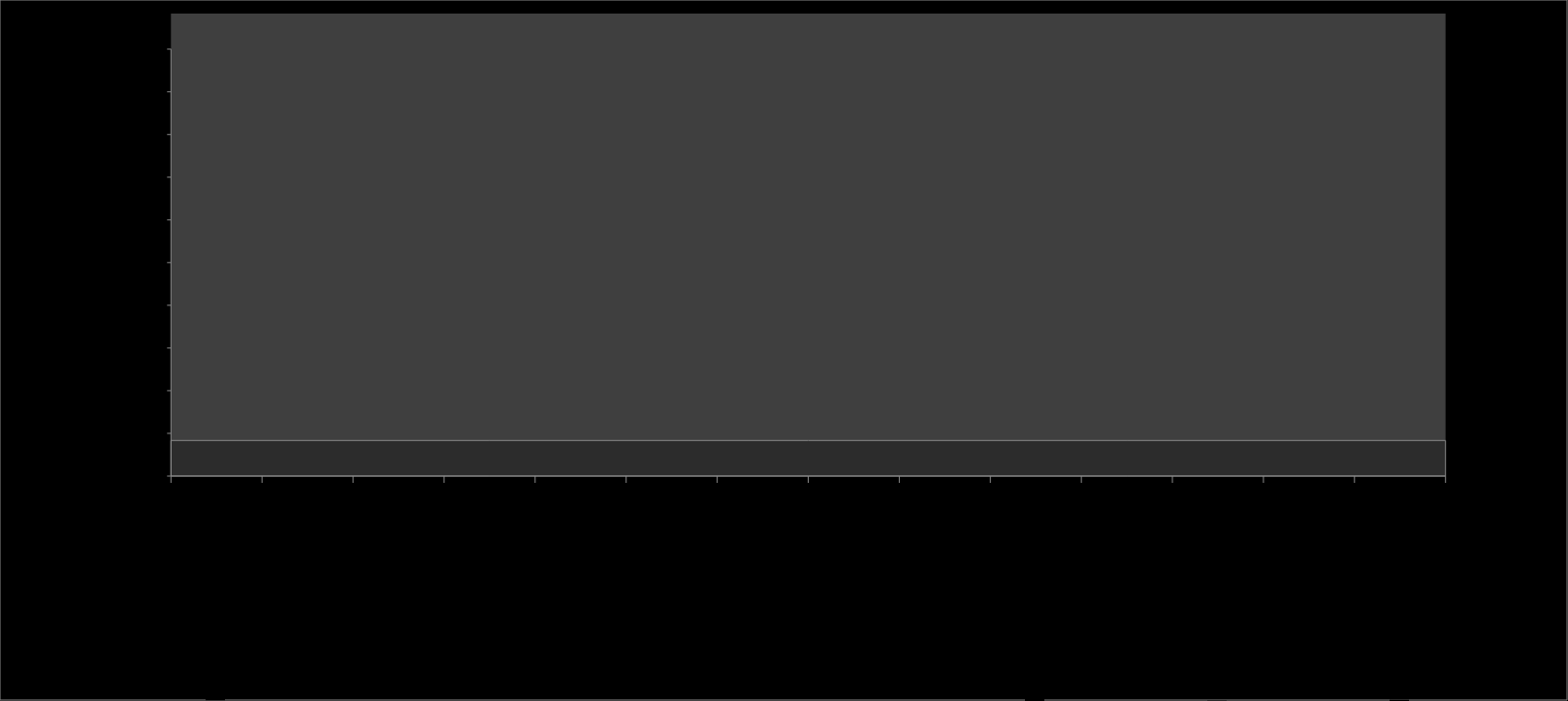
| Category | Series 0 |
|---|---|
| REPETITIVE MOV | 0 |
| LIFTING | 0 |
| CARRYING | 0 |
| PUSH-PULL | 0 |
| POSTURES | 0 |
| ORGANIZATIONAL | 0 |
| LIGHTING | 0 |
| RADIATION UV | 0 |
| NOISE | 0 |
| MICROCLIMATE | 0 |
| VIBRATIONS | 0 |
| EQUIPMENTS AND TOOLS | 0 |
| MACHINERY | 0 |
| POLLUTTANTS OR OTHERS | 0 |